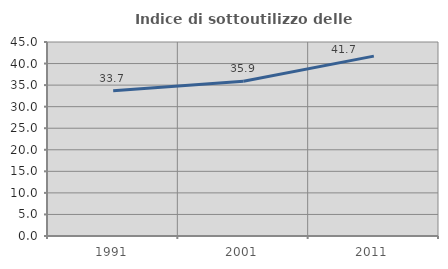
| Category | Indice di sottoutilizzo delle abitazioni  |
|---|---|
| 1991.0 | 33.689 |
| 2001.0 | 35.875 |
| 2011.0 | 41.719 |